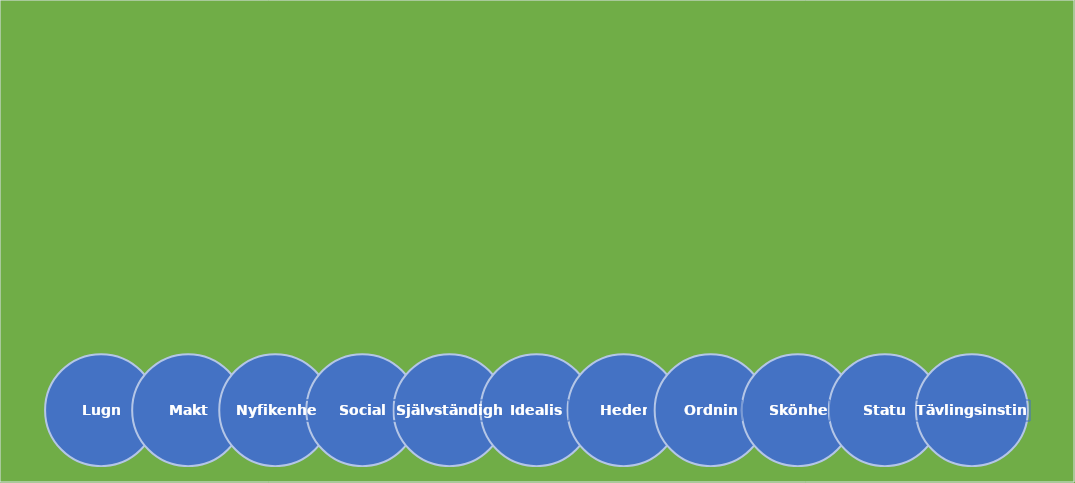
| Category | Summa |
|---|---|
| 0 | 0 |
| 1 | 0 |
| 2 | 0 |
| 3 | 0 |
| 4 | 0 |
| 5 | 0 |
| 6 | 0 |
| 7 | 0 |
| 8 | 0 |
| 9 | 0 |
| 10 | 0 |